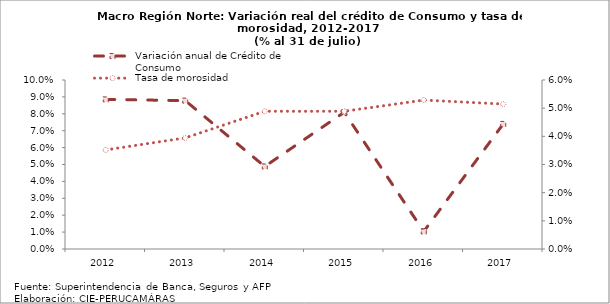
| Category | Variación anual de Crédito de Consumo |
|---|---|
| 2012.0 | 0.089 |
| 2013.0 | 0.088 |
| 2014.0 | 0.049 |
| 2015.0 | 0.081 |
| 2016.0 | 0.01 |
| 2017.0 | 0.074 |